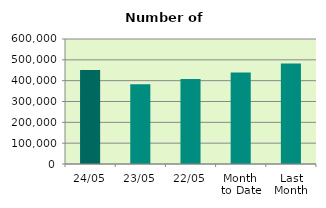
| Category | Series 0 |
|---|---|
| 24/05 | 451560 |
| 23/05 | 383196 |
| 22/05 | 407972 |
| Month 
to Date | 439478 |
| Last
Month | 481931.444 |